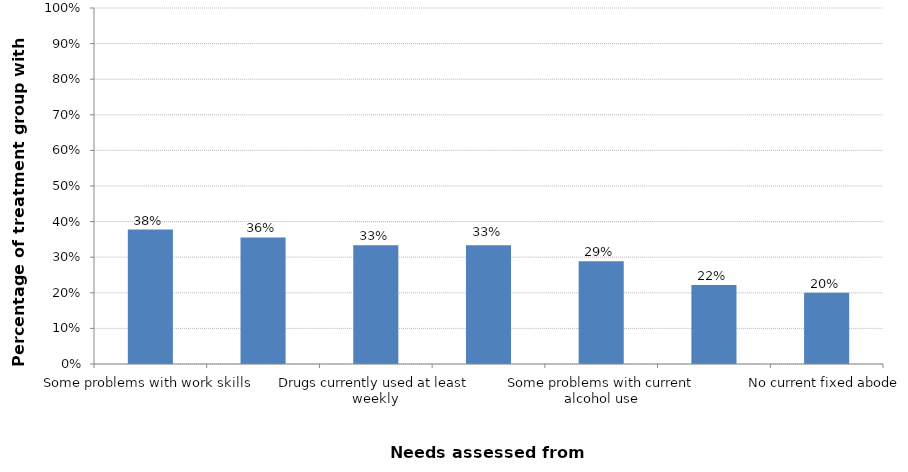
| Category | Percentage of treatment group with need |
|---|---|
| Some problems with work skills | 0.378 |
| Some problems with close family relationships | 0.356 |
| Drugs currently used at least weekly | 0.333 |
| Perpetrator of domestic violence at any time | 0.333 |
| Some problems with current alcohol use | 0.289 |
| Some problems with parenting responsibilities | 0.222 |
| No current fixed abode | 0.2 |